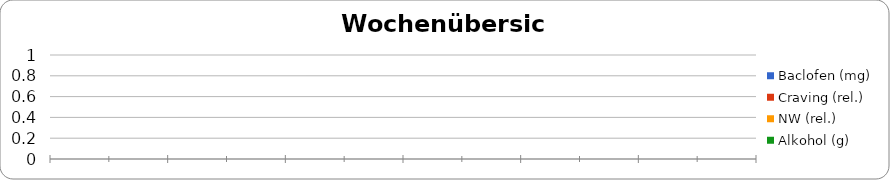
| Category | Baclofen (mg) | Craving (rel.) | NW (rel.) | Alkohol (g) |
|---|---|---|---|---|
| 0 | 0 | 0 | 0 | 0 |
| 1 | 0 | 0 | 0 | 0 |
| 2 | 0 | 0 | 0 | 0 |
| 3 | 0 | 0 | 0 | 0 |
| 4 | 0 | 0 | 0 | 0 |
| 5 | 0 | 0 | 0 | 0 |